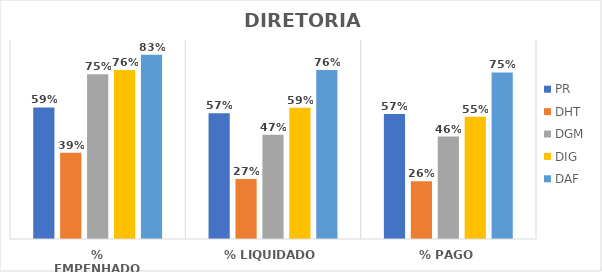
| Category | PR | DHT | DGM | DIG | DAF |
|---|---|---|---|---|---|
| % EMPENHADO | 0.595 | 0.39 | 0.745 | 0.765 | 0.833 |
| % LIQUIDADO | 0.569 | 0.271 | 0.472 | 0.593 | 0.764 |
| % PAGO | 0.566 | 0.261 | 0.463 | 0.553 | 0.753 |